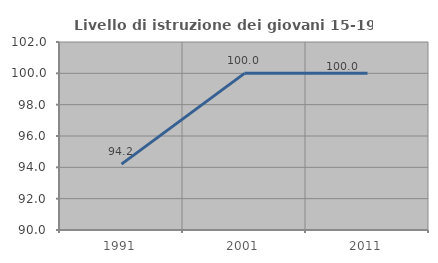
| Category | Livello di istruzione dei giovani 15-19 anni |
|---|---|
| 1991.0 | 94.203 |
| 2001.0 | 100 |
| 2011.0 | 100 |